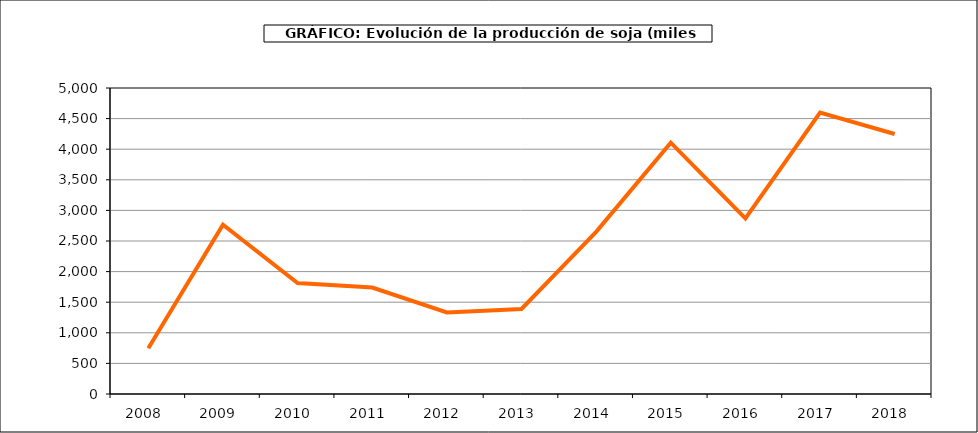
| Category | Producción |
|---|---|
| 2008.0 | 748 |
| 2009.0 | 2767 |
| 2010.0 | 1812 |
| 2011.0 | 1740 |
| 2012.0 | 1333 |
| 2013.0 | 1390 |
| 2014.0 | 2650 |
| 2015.0 | 4106 |
| 2016.0 | 2869 |
| 2017.0 | 4599 |
| 2018.0 | 4249 |